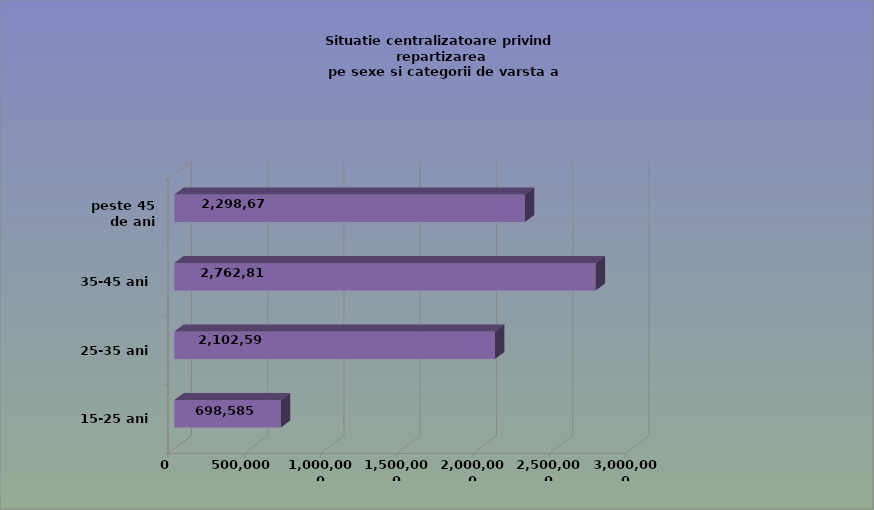
| Category | 15-25 ani 25-35 ani 35-45 ani peste 45 de ani |
|---|---|
| 15-25 ani | 698585 |
| 25-35 ani | 2102595 |
| 35-45 ani | 2762816 |
| peste 45 de ani | 2298677 |